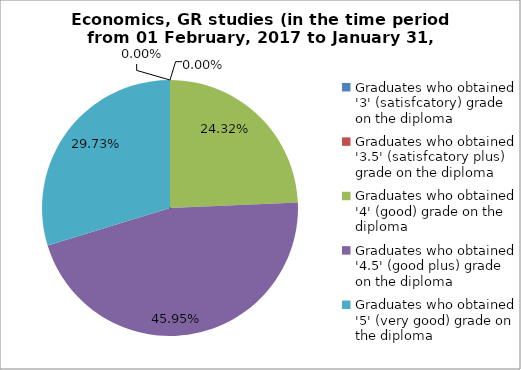
| Category | Series 0 |
|---|---|
| Graduates who obtained '3' (satisfcatory) grade on the diploma  | 0 |
| Graduates who obtained '3.5' (satisfcatory plus) grade on the diploma  | 0 |
| Graduates who obtained '4' (good) grade on the diploma  | 24.324 |
| Graduates who obtained '4.5' (good plus) grade on the diploma  | 45.946 |
| Graduates who obtained '5' (very good) grade on the diploma  | 29.73 |